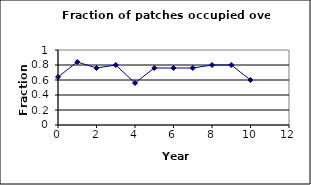
| Category | Series 0 |
|---|---|
| 0.0 | 0.64 |
| 1.0 | 0.84 |
| 2.0 | 0.76 |
| 3.0 | 0.8 |
| 4.0 | 0.56 |
| 5.0 | 0.76 |
| 6.0 | 0.76 |
| 7.0 | 0.76 |
| 8.0 | 0.8 |
| 9.0 | 0.8 |
| 10.0 | 0.6 |